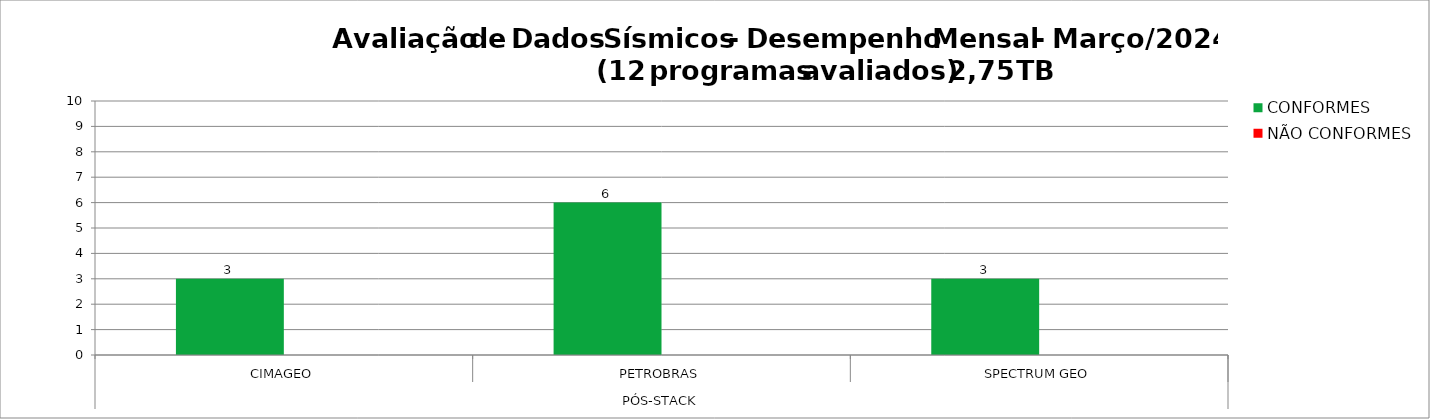
| Category | CONFORMES | NÃO CONFORMES |
|---|---|---|
| 0 | 3 |  |
| 1 | 6 |  |
| 2 | 3 |  |